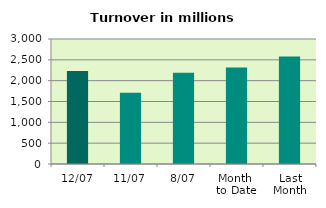
| Category | Series 0 |
|---|---|
| 12/07 | 2234.098 |
| 11/07 | 1711.121 |
| 8/07 | 2188.977 |
| Month 
to Date | 2316.382 |
| Last
Month | 2579.746 |